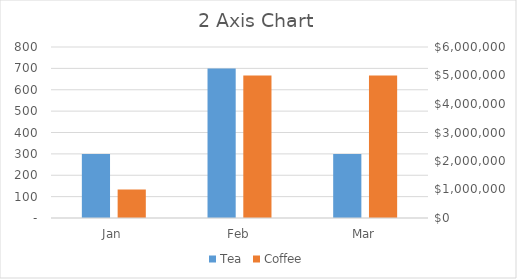
| Category | Tea | Series 2 |
|---|---|---|
| Jan | 300 |  |
| Feb | 700 |  |
| Mar | 300 |  |